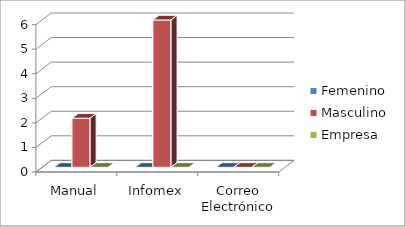
| Category | Femenino | Masculino | Empresa |
|---|---|---|---|
| 0 | 0 | 2 | 0 |
| 1 | 0 | 6 | 0 |
| 2 | 0 | 0 | 0 |